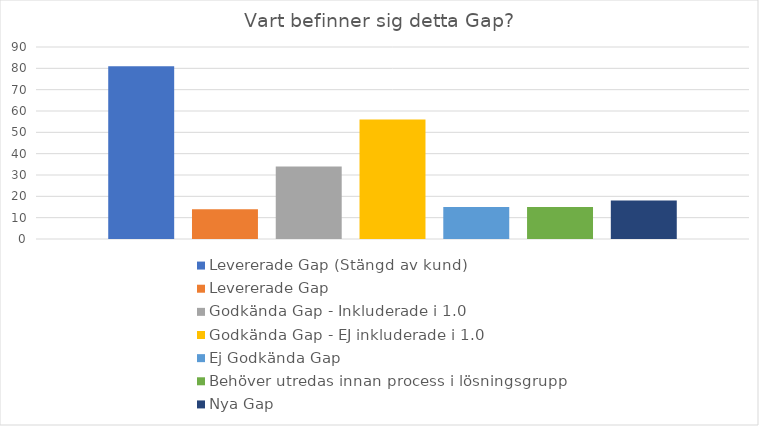
| Category | Levererade Gap (Stängd av kund) | Levererade Gap | Godkända Gap - Inkluderade i 1.0 | Godkända Gap - EJ inkluderade i 1.0 | Ej Godkända Gap | Behöver utredas innan process i lösningsgrupp | Nya Gap |
|---|---|---|---|---|---|---|---|
| 0 | 81 | 14 | 34 | 56 | 15 | 15 | 18 |